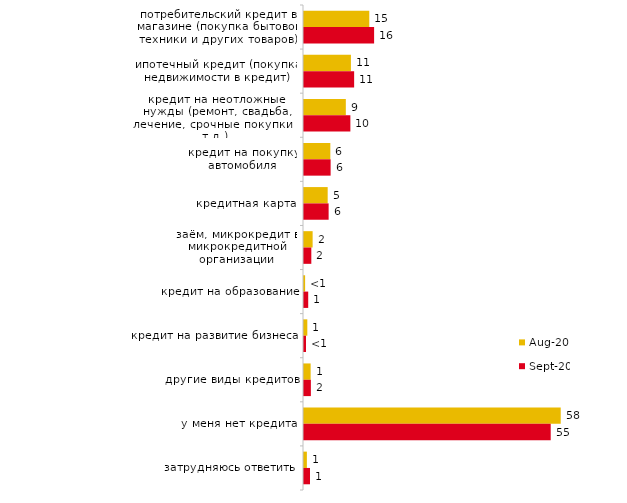
| Category | авг.20 | сен.20 |
|---|---|---|
| потребительский кредит в магазине (покупка бытовой техники и других товаров) | 14.647 | 15.729 |
| ипотечный кредит (покупка недвижимости в кредит) | 10.526 | 11.249 |
| кредит на неотложные нужды (ремонт, свадьба, лечение, срочные покупки и т.д.) | 9.384 | 10.403 |
| кредит на покупку автомобиля | 5.909 | 5.973 |
| кредитная карта | 5.313 | 5.525 |
| заём, микрокредит в микрокредитной организации | 1.936 | 1.643 |
| кредит на образование | 0.248 | 0.946 |
| кредит на развитие бизнеса | 0.745 | 0.448 |
| другие виды кредитов | 1.49 | 1.543 |
| у меня нет кредита | 57.597 | 55.351 |
| затрудняюсь ответить | 0.645 | 1.344 |